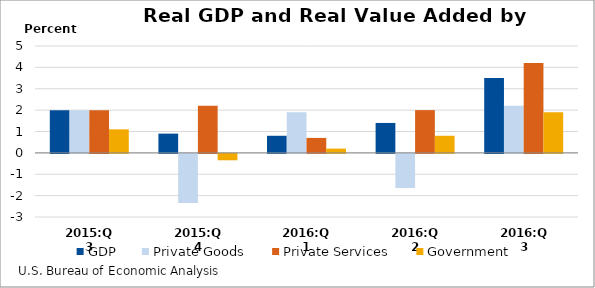
| Category | GDP | Private Goods | Private Services | Government |
|---|---|---|---|---|
| 2015:Q3 | 2 | 2 | 2 | 1.1 |
| 2015:Q4 | 0.9 | -2.3 | 2.2 | -0.3 |
| 2016:Q1 | 0.8 | 1.9 | 0.7 | 0.2 |
| 2016:Q2 | 1.4 | -1.6 | 2 | 0.8 |
| 2016:Q3 | 3.5 | 2.2 | 4.2 | 1.9 |